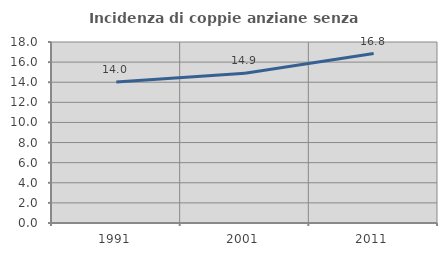
| Category | Incidenza di coppie anziane senza figli  |
|---|---|
| 1991.0 | 14.011 |
| 2001.0 | 14.894 |
| 2011.0 | 16.848 |